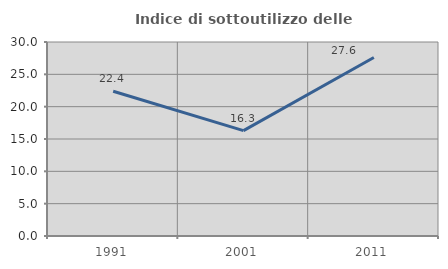
| Category | Indice di sottoutilizzo delle abitazioni  |
|---|---|
| 1991.0 | 22.387 |
| 2001.0 | 16.288 |
| 2011.0 | 27.613 |